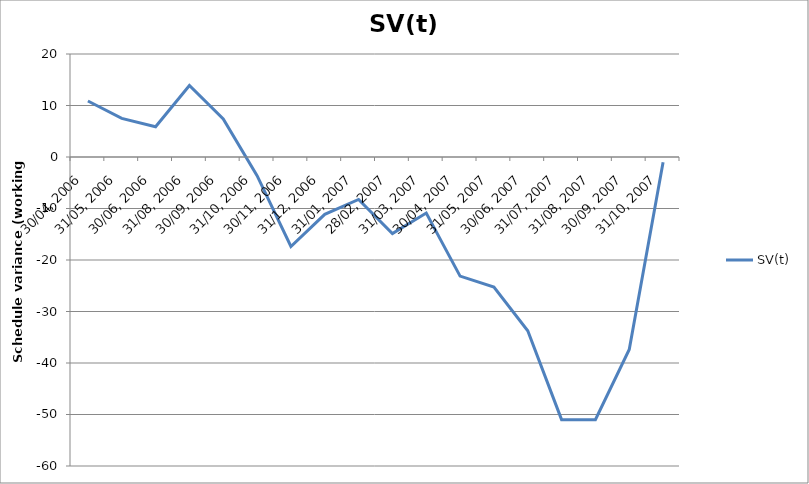
| Category | SV(t) |
|---|---|
| 30/04, 2006 | 10.875 |
| 31/05, 2006 | 7.5 |
| 30/06, 2006 | 5.875 |
| 31/08, 2006 | 13.875 |
| 30/09, 2006 | 7.375 |
| 31/10, 2006 | -3.625 |
| 30/11, 2006 | -17.375 |
| 31/12, 2006 | -11.125 |
| 31/01, 2007 | -8.25 |
| 28/02, 2007 | -14.875 |
| 31/03, 2007 | -10.875 |
| 30/04, 2007 | -23.125 |
| 31/05, 2007 | -25.25 |
| 30/06, 2007 | -33.75 |
| 31/07, 2007 | -51 |
| 31/08, 2007 | -51 |
| 30/09, 2007 | -37.375 |
| 31/10, 2007 | -1 |